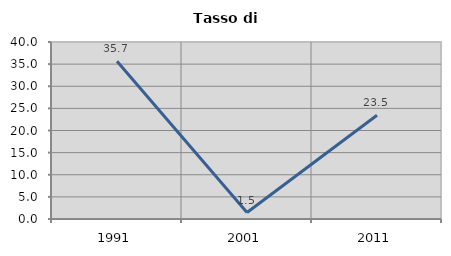
| Category | Tasso di disoccupazione   |
|---|---|
| 1991.0 | 35.659 |
| 2001.0 | 1.46 |
| 2011.0 | 23.451 |